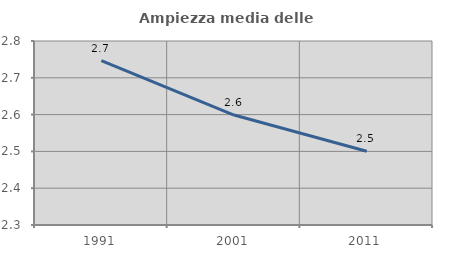
| Category | Ampiezza media delle famiglie |
|---|---|
| 1991.0 | 2.747 |
| 2001.0 | 2.599 |
| 2011.0 | 2.501 |